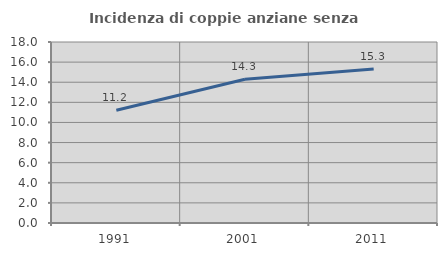
| Category | Incidenza di coppie anziane senza figli  |
|---|---|
| 1991.0 | 11.211 |
| 2001.0 | 14.296 |
| 2011.0 | 15.312 |